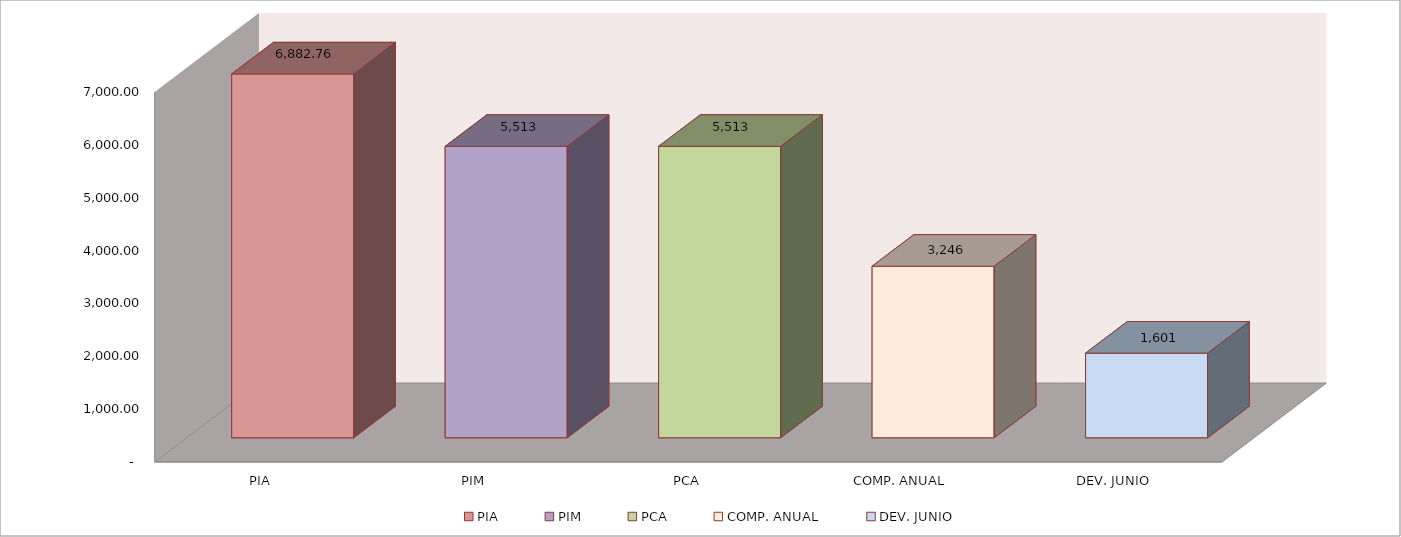
| Category | 011 MINISTERIO DE SALUD |
|---|---|
| PIA | 6882.759 |
| PIM | 5513.21 |
| PCA | 5513.21 |
| COMP. ANUAL | 3245.502 |
| DEV. JUNIO | 1601.13 |